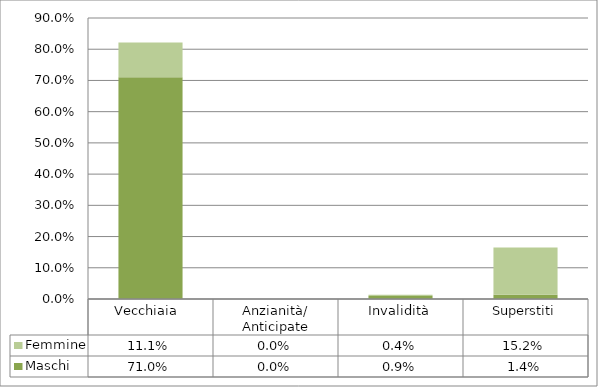
| Category | Maschi | Femmine |
|---|---|---|
| Vecchiaia  | 0.71 | 0.111 |
| Anzianità/ Anticipate | 0 | 0 |
| Invalidità | 0.009 | 0.004 |
| Superstiti | 0.014 | 0.152 |